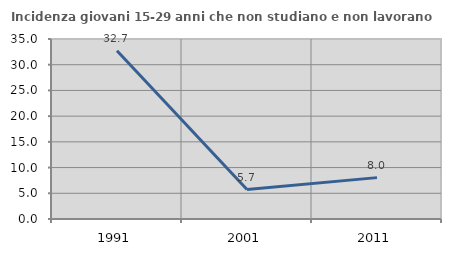
| Category | Incidenza giovani 15-29 anni che non studiano e non lavorano  |
|---|---|
| 1991.0 | 32.701 |
| 2001.0 | 5.727 |
| 2011.0 | 8.046 |